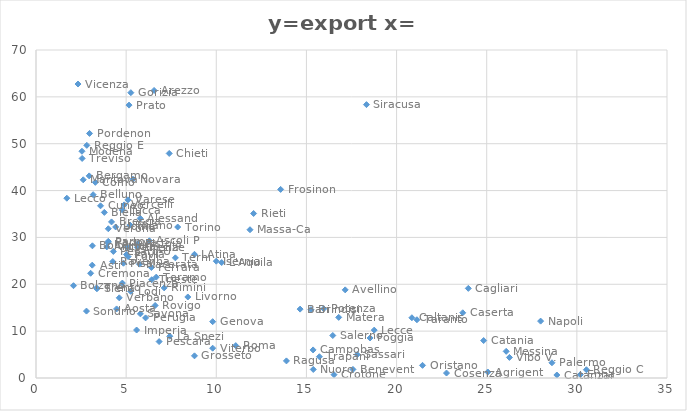
| Category | y=export x= disocc |
|---|---|
| 7.86 | 32.22 |
| 4.89 | 36.95 |
| 5.38 | 42.42 |
| 3.58 | 36.75 |
| 3.12 | 24.08 |
| 5.78 | 34.07 |
| 3.79 | 35.34 |
| 4.62 | 17.11 |
| 4.47 | 14.74 |
| 5.58 | 10.24 |
| 5.79 | 13.69 |
| 9.8 | 12.02 |
| 7.42 | 8.91 |
| 5.1 | 38.02 |
| 3.29 | 41.75 |
| 2.8 | 14.28 |
| 5.22 | 32.63 |
| 2.95 | 43.13 |
| 4.19 | 33.31 |
| 5.02 | 26.35 |
| 3.03 | 22.35 |
| 2.62 | 42.3 |
| 1.71 | 38.37 |
| 5.25 | 18.5 |
| 2.08 | 19.7 |
| 3.36 | 19.23 |
| 4.01 | 31.85 |
| 2.33 | 62.74 |
| 3.17 | 39.12 |
| 2.56 | 46.86 |
| 5.06 | 27.93 |
| 3.99 | 28.88 |
| 6.61 | 15.48 |
| 4.42 | 32.23 |
| 5.26 | 60.89 |
| 6.42 | 20.97 |
| 2.97 | 52.19 |
| 4.79 | 20.26 |
| 4.01 | 29.17 |
| 2.82 | 49.65 |
| 2.55 | 48.39 |
| 3.13 | 28.21 |
| 6.4 | 23.58 |
| 4.26 | 24.85 |
| 5.11 | 25.9 |
| 7.11 | 19.23 |
| 4.29 | 27.01 |
| 3.93 | 27.98 |
| 5.74 | 24.3 |
| 6.29 | 29.29 |
| 11.87 | 31.64 |
| 4.79 | 35.85 |
| 5.64 | 28.65 |
| 5.62 | 27.87 |
| 8.42 | 17.29 |
| 4.85 | 24.49 |
| 6.55 | 61.37 |
| 3.38 | 19.04 |
| 8.79 | 4.73 |
| 5.16 | 58.24 |
| 6.08 | 12.83 |
| 7.73 | 25.64 |
| 9.8 | 6.36 |
| 12.07 | 35.11 |
| 11.08 | 6.91 |
| 8.79 | 26.4 |
| 13.57 | 40.25 |
| 23.67 | 13.92 |
| 17.58 | 1.83 |
| 27.99 | 12.14 |
| 17.15 | 18.81 |
| 16.46 | 9.07 |
| 10.3 | 24.64 |
| 6.67 | 21.53 |
| 6.83 | 7.77 |
| 7.39 | 47.92 |
| 15.37 | 5.99 |
| 10.0 | 24.93 |
| 18.53 | 8.54 |
| 14.65 | 14.7 |
| 21.13 | 12.43 |
| 15.25 | 14.6 |
| 18.76 | 10.22 |
| 15.96 | 14.78 |
| 16.79 | 12.94 |
| 22.77 | 1.06 |
| 28.89 | 0.64 |
| 30.53 | 1.76 |
| 16.53 | 0.71 |
| 26.26 | 4.39 |
| 15.72 | 4.54 |
| 28.62 | 3.25 |
| 26.08 | 5.69 |
| 25.06 | 1.28 |
| 20.85 | 12.86 |
| 30.19 | 0.71 |
| 24.83 | 7.99 |
| 13.89 | 3.65 |
| 18.33 | 58.34 |
| 17.82 | 5 |
| 15.38 | 1.82 |
| 23.98 | 19.13 |
| 21.44 | 2.7 |